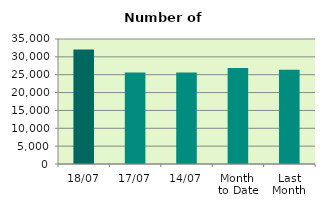
| Category | Series 0 |
|---|---|
| 18/07 | 32076 |
| 17/07 | 25594 |
| 14/07 | 25594 |
| Month 
to Date | 26890.5 |
| Last
Month | 26399.455 |